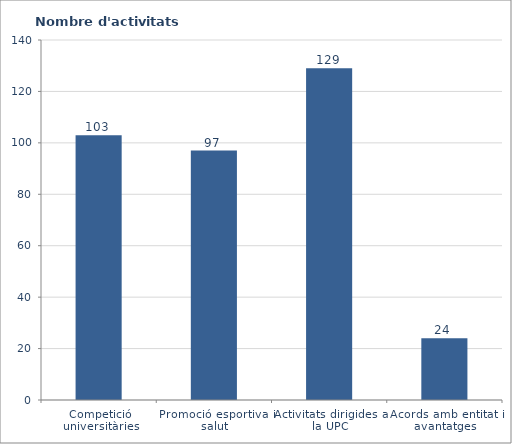
| Category | Nombre d'activitats ofertades |
|---|---|
| Competició universitàries | 103 |
| Promoció esportiva i salut | 97 |
| Activitats dirigides a la UPC | 129 |
| Acords amb entitat i avantatges | 24 |